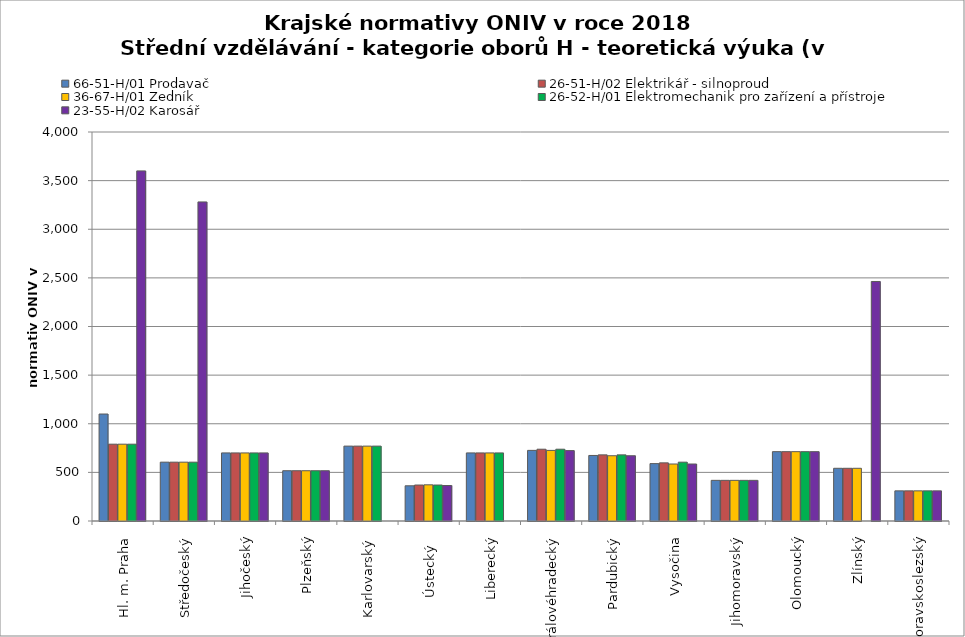
| Category | 66-51-H/01 Prodavač | 26-51-H/02 Elektrikář - silnoproud | 36-67-H/01 Zedník | 26-52-H/01 Elektromechanik pro zařízení a přístroje | 23-55-H/02 Karosář |
|---|---|---|---|---|---|
| Hl. m. Praha | 1100 | 790 | 790 | 790 | 3600 |
| Středočeský | 605 | 605 | 605 | 605 | 3281 |
| Jihočeský | 700 | 700 | 700 | 700 | 700 |
| Plzeňský | 517 | 517 | 517 | 517 | 517 |
| Karlovarský  | 770 | 770 | 770 | 770 | 0 |
| Ústecký   | 362 | 370 | 372 | 370 | 365 |
| Liberecký | 700 | 700 | 700 | 700 | 0 |
| Královéhradecký | 726.2 | 738.2 | 726 | 738.2 | 724.1 |
| Pardubický | 674 | 680 | 671 | 680 | 671 |
| Vysočina | 590 | 598 | 586 | 605 | 586 |
| Jihomoravský | 418 | 418 | 418 | 418 | 418 |
| Olomoucký | 713 | 713 | 713 | 713 | 713 |
| Zlínský | 542 | 542 | 542 | 0 | 2463 |
| Moravskoslezský | 310 | 310 | 310 | 310 | 310 |